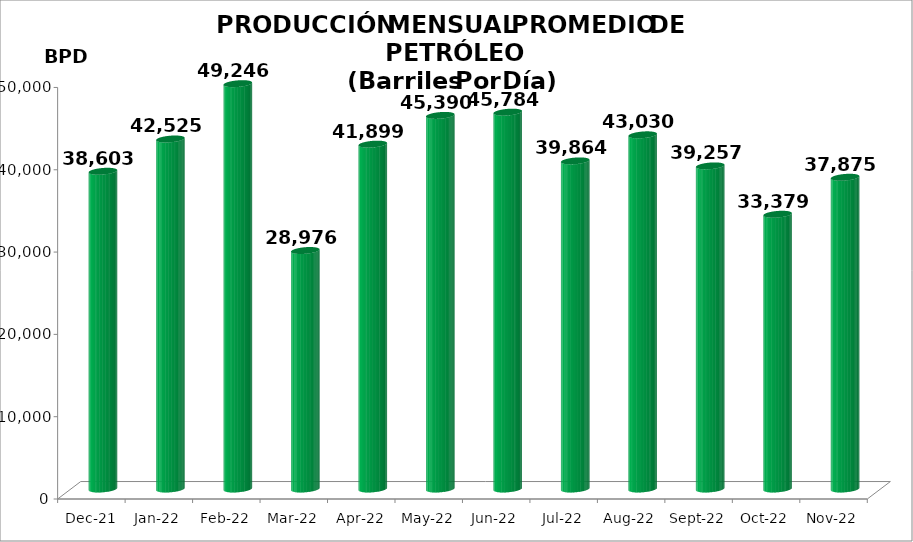
| Category | Series 0 |
|---|---|
| 2021-12-01 | 38603 |
| 2022-01-01 | 42524.516 |
| 2022-02-01 | 49246 |
| 2022-03-01 | 28976.419 |
| 2022-04-01 | 41899 |
| 2022-05-01 | 45390.387 |
| 2022-06-01 | 45784.1 |
| 2022-07-01 | 39863.677 |
| 2022-08-01 | 43030.065 |
| 2022-09-01 | 39257.333 |
| 2022-10-01 | 33379.161 |
| 2022-11-01 | 37875.067 |